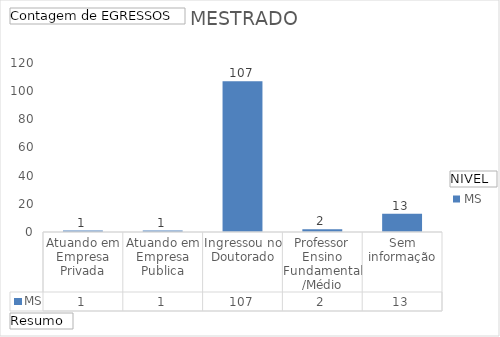
| Category | MS |
|---|---|
| Atuando em Empresa Privada | 1 |
| Atuando em Empresa Publica | 1 |
| Ingressou no Doutorado | 107 |
| Professor Ensino Fundamental/Médio | 2 |
| Sem informação | 13 |